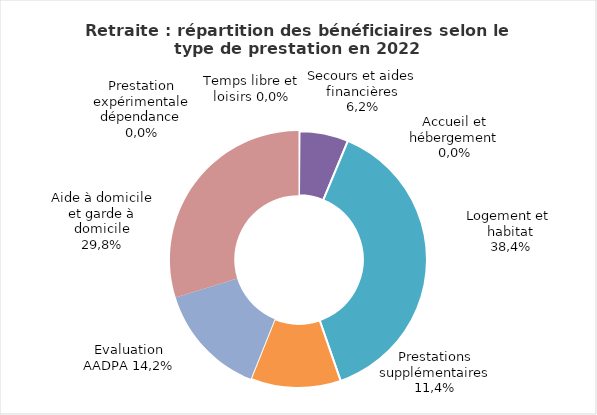
| Category | Series 0 |
|---|---|
| Accueil et hébergement | 65 |
| Prestation Expérimentale Dépendance PED | 23 |
| Temps libre et loisirs | 46 |
| Secours et aides financières | 6769 |
| Logement et habitat | 42174 |
| Prestations supplémentaires | 12488 |
| Evaluation AADPA | 15569 |
| Aide à domicile  et garde à domicile | 32706 |